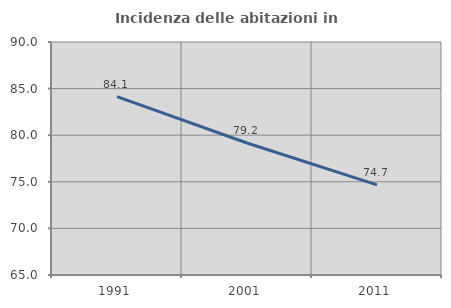
| Category | Incidenza delle abitazioni in proprietà  |
|---|---|
| 1991.0 | 84.146 |
| 2001.0 | 79.167 |
| 2011.0 | 74.667 |